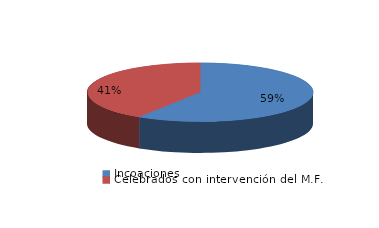
| Category | Series 0 |
|---|---|
| Incoaciones | 5680 |
| Celebrados con intervención del M.F. | 3948 |